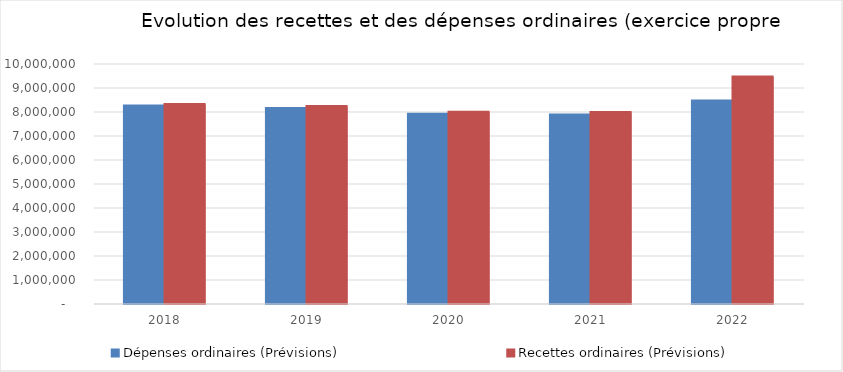
| Category | Dépenses ordinaires (Prévisions) | Recettes ordinaires (Prévisions) |
|---|---|---|
| 2018.0 | 8249245.37 | 8313674.74 |
| 2019.0 | 8141517.75 | 8226553.73 |
| 2020.0 | 7905835.94 | 7987434.23 |
| 2021.0 | 7876339.12 | 7974751.87 |
| 2022.0 | 8457256.17 | 9455947.67 |